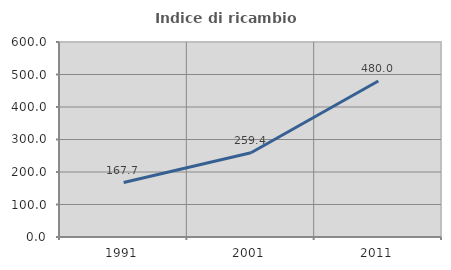
| Category | Indice di ricambio occupazionale  |
|---|---|
| 1991.0 | 167.692 |
| 2001.0 | 259.375 |
| 2011.0 | 480 |